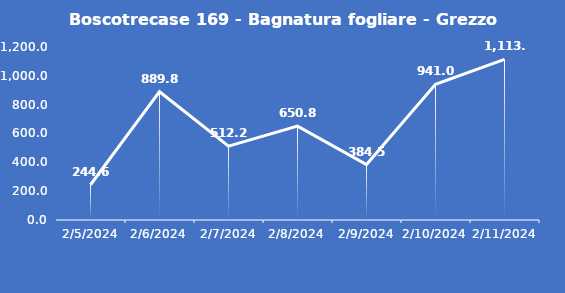
| Category | Boscotrecase 169 - Bagnatura fogliare - Grezzo (min) |
|---|---|
| 2/5/24 | 244.6 |
| 2/6/24 | 889.8 |
| 2/7/24 | 512.2 |
| 2/8/24 | 650.8 |
| 2/9/24 | 384.5 |
| 2/10/24 | 941 |
| 2/11/24 | 1113.9 |